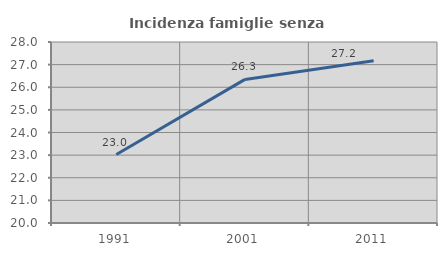
| Category | Incidenza famiglie senza nuclei |
|---|---|
| 1991.0 | 23.026 |
| 2001.0 | 26.347 |
| 2011.0 | 27.169 |